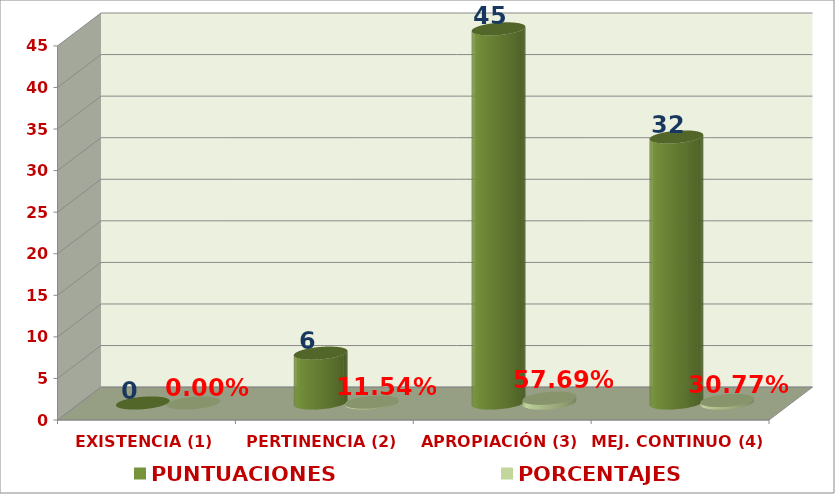
| Category | PUNTUACIONES | PORCENTAJES |
|---|---|---|
| EXISTENCIA (1) | 0 | 0 |
| PERTINENCIA (2) | 6 | 0.115 |
| APROPIACIÓN (3) | 45 | 0.577 |
| MEJ. CONTINUO (4) | 32 | 0.308 |